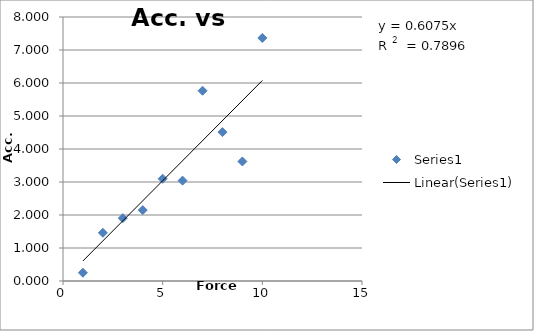
| Category | Series 0 |
|---|---|
| 1.0 | 0.25 |
| 2.0 | 1.46 |
| 3.0 | 1.904 |
| 4.0 | 2.148 |
| 5.0 | 3.099 |
| 6.0 | 3.041 |
| 7.0 | 5.765 |
| 8.0 | 4.511 |
| 9.0 | 3.623 |
| 10.0 | 7.365 |